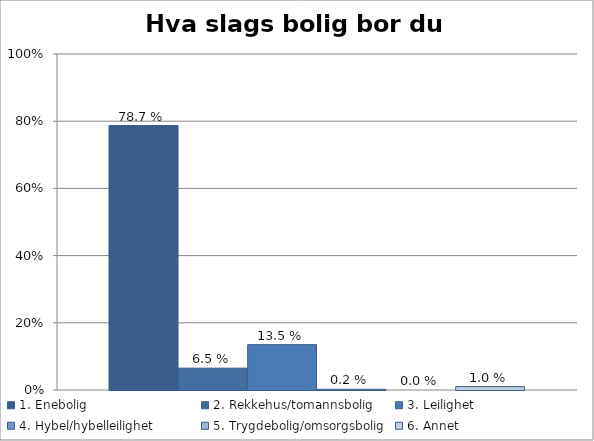
| Category | 1. Enebolig | 2. Rekkehus/tomannsbolig | 3. Leilighet | 4. Hybel/hybelleilighet | 5. Trygdebolig/omsorgsbolig | 6. Annet |
|---|---|---|---|---|---|---|
| Hva slags bolig bor du i? | 0.787 | 0.065 | 0.135 | 0.002 | 0 | 0.01 |